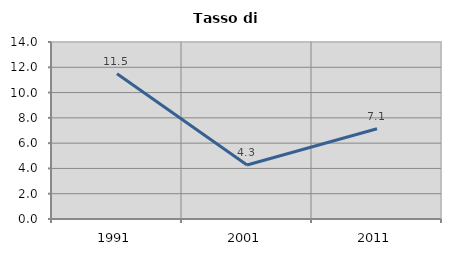
| Category | Tasso di disoccupazione   |
|---|---|
| 1991.0 | 11.482 |
| 2001.0 | 4.271 |
| 2011.0 | 7.134 |